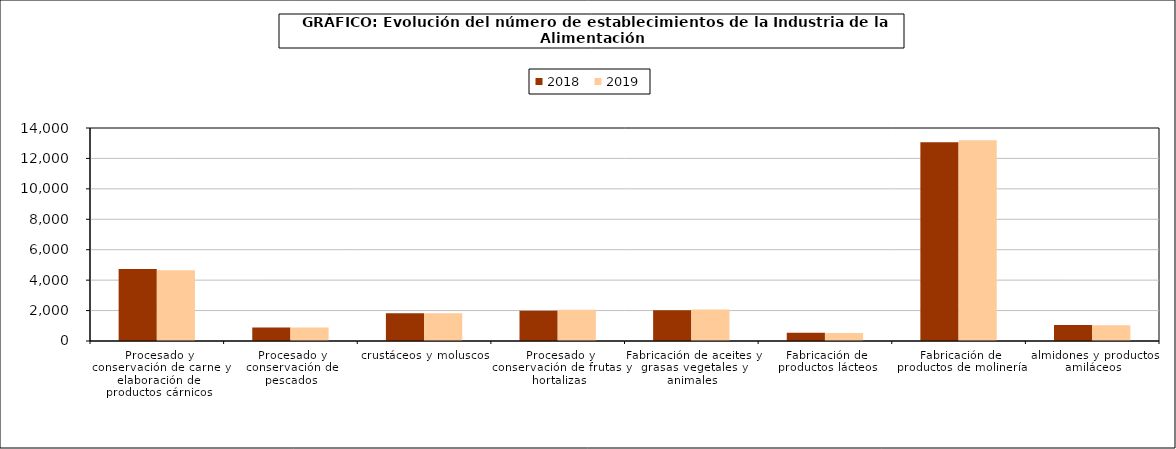
| Category | 2018 | 2019 |
|---|---|---|
| 0 | 4727 | 4649 |
| 1 | 884 | 895 |
| 2 | 1821 | 1818 |
| 3 | 1995 | 2054 |
| 4 | 2020 | 2065 |
| 5 | 546 | 531 |
| 6 | 13065 | 13196 |
| 7 | 1045 | 1043 |